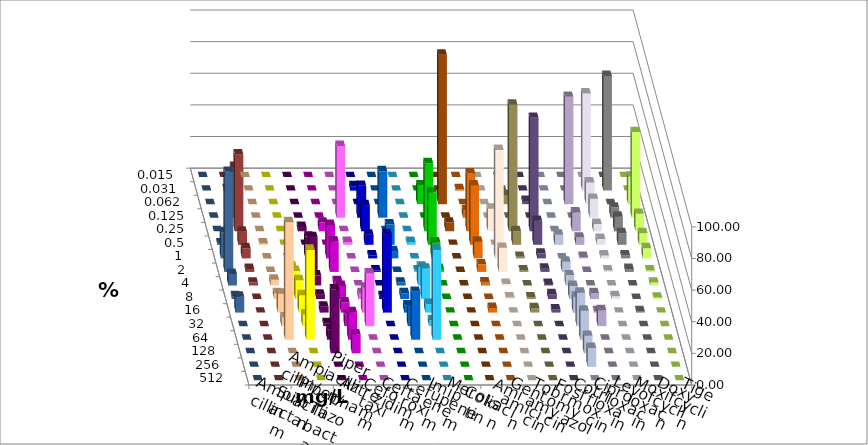
| Category | Ampicillin | Ampicillin/ Sulbactam | Piperacillin | Piperacillin/ Tazobactam | Aztreonam | Cefotaxim | Ceftazidim | Cefuroxim | Imipenem | Meropenem | Colistin | Amikacin | Gentamicin | Tobramycin | Fosfomycin | Cotrimoxazol | Ciprofloxacin | Levofloxacin | Moxifloxacin | Doxycyclin | Tigecyclin |
|---|---|---|---|---|---|---|---|---|---|---|---|---|---|---|---|---|---|---|---|---|---|
| 0.015 | 0 | 0 | 0 | 0 | 0 | 0 | 0 | 0 | 0 | 0 | 0 | 0 | 0 | 0 | 0 | 0 | 0 | 0 | 0 | 0 | 0 |
| 0.031 | 0 | 0 | 0 | 0 | 0 | 2.752 | 0 | 0 | 0 | 0 | 0.962 | 0 | 0 | 0 | 0 | 0 | 61.468 | 72.477 | 0 | 0 | 0.917 |
| 0.062 | 0 | 0 | 0 | 0 | 0 | 0 | 0 | 0 | 11.927 | 94.495 | 0 | 0 | 5.714 | 2.02 | 0 | 67.89 | 13.761 | 0 | 17.431 | 0 | 0 |
| 0.125 | 0 | 0 | 0 | 0 | 45.37 | 20.183 | 29.358 | 0 | 0 | 0 | 4.808 | 0 | 0 | 0 | 0 | 0 | 11.927 | 6.422 | 54.128 | 0 | 32.11 |
| 0.25 | 0 | 0 | 2.752 | 5.505 | 0 | 16.514 | 0 | 0 | 43.119 | 5.505 | 36.538 | 14.286 | 80 | 71.717 | 0 | 11.927 | 4.587 | 9.174 | 11.009 | 0 | 48.624 |
| 0.5 | 0.917 | 0 | 0 | 0 | 1.852 | 6.422 | 12.844 | 1.835 | 33.028 | 0 | 37.5 | 0 | 8.571 | 15.152 | 6.422 | 4.587 | 3.67 | 7.339 | 7.339 | 0.917 | 8.257 |
| 1.0 | 0 | 0 | 13.761 | 21.101 | 0 | 1.835 | 4.587 | 0 | 10.092 | 0 | 10.577 | 68.571 | 0.952 | 3.03 | 0 | 0.917 | 1.835 | 1.835 | 6.422 | 16.514 | 6.422 |
| 2.0 | 0 | 3.67 | 22.018 | 19.266 | 0 | 0.917 | 0 | 0.917 | 1.835 | 0 | 4.808 | 15.238 | 0.952 | 2.02 | 6.422 | 0 | 0.917 | 1.835 | 0.917 | 63.303 | 1.835 |
| 4.0 | 3.67 | 9.174 | 6.422 | 2.752 | 0 | 0 | 1.835 | 11.927 | 0 | 0 | 1.923 | 0.952 | 0 | 1.01 | 6.422 | 0 | 0 | 0 | 1.835 | 7.339 | 1.835 |
| 8.0 | 3.67 | 11.927 | 2.752 | 8.257 | 3.704 | 1.835 | 3.67 | 19.266 | 0 | 0 | 0 | 0.952 | 0.952 | 3.03 | 8.257 | 3.67 | 1.835 | 0 | 0.917 | 1.835 | 0 |
| 16.0 | 11.927 | 11.009 | 3.67 | 6.422 | 15.741 | 49.541 | 4.587 | 5.505 | 0 | 0 | 2.885 | 0 | 2.857 | 2.02 | 10.092 | 0.917 | 0 | 0.917 | 0 | 10.092 | 0 |
| 32.0 | 5.505 | 7.339 | 1.835 | 7.339 | 33.333 | 0 | 12.844 | 3.67 | 0 | 0 | 0 | 0 | 0 | 0 | 21.101 | 10.092 | 0 | 0 | 0 | 0 | 0 |
| 64.0 | 74.312 | 56.881 | 6.422 | 17.431 | 0 | 0 | 30.275 | 56.881 | 0 | 0 | 0 | 0 | 0 | 0 | 18.349 | 0 | 0 | 0 | 0 | 0 | 0 |
| 128.0 | 0 | 0 | 40.367 | 11.927 | 0 | 0 | 0 | 0 | 0 | 0 | 0 | 0 | 0 | 0 | 11.009 | 0 | 0 | 0 | 0 | 0 | 0 |
| 256.0 | 0 | 0 | 0 | 0 | 0 | 0 | 0 | 0 | 0 | 0 | 0 | 0 | 0 | 0 | 11.927 | 0 | 0 | 0 | 0 | 0 | 0 |
| 512.0 | 0 | 0 | 0 | 0 | 0 | 0 | 0 | 0 | 0 | 0 | 0 | 0 | 0 | 0 | 0 | 0 | 0 | 0 | 0 | 0 | 0 |